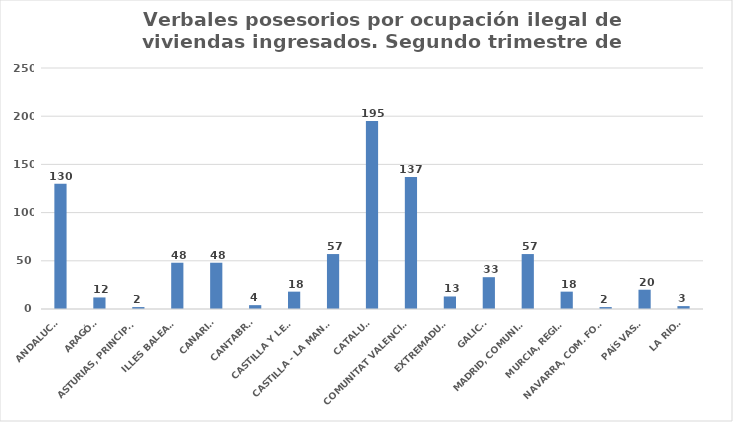
| Category | Series 0 |
|---|---|
| ANDALUCÍA | 130 |
| ARAGÓN | 12 |
| ASTURIAS, PRINCIPADO | 2 |
| ILLES BALEARS | 48 |
| CANARIAS | 48 |
| CANTABRIA | 4 |
| CASTILLA Y LEÓN | 18 |
| CASTILLA - LA MANCHA | 57 |
| CATALUÑA | 195 |
| COMUNITAT VALENCIANA | 137 |
| EXTREMADURA | 13 |
| GALICIA | 33 |
| MADRID, COMUNIDAD | 57 |
| MURCIA, REGIÓN | 18 |
| NAVARRA, COM. FORAL | 2 |
| PAÍS VASCO | 20 |
| LA RIOJA | 3 |